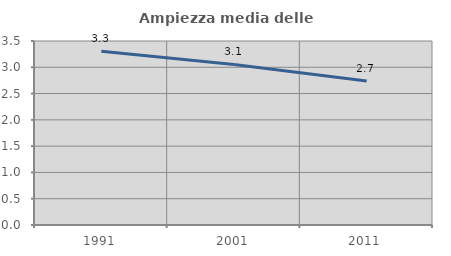
| Category | Ampiezza media delle famiglie |
|---|---|
| 1991.0 | 3.303 |
| 2001.0 | 3.053 |
| 2011.0 | 2.741 |